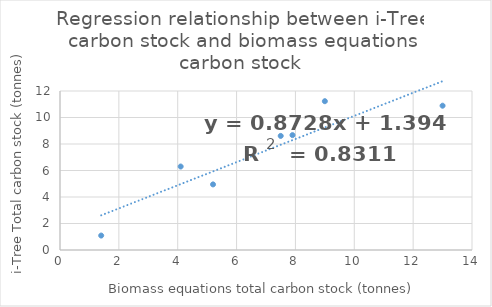
| Category | CPF-European Larch |
|---|---|
| 4.1 | 6.3 |
| 7.5 | 8.61 |
| 9.0 | 11.23 |
| 5.2 | 4.95 |
| 1.4 | 1.09 |
| 7.9 | 8.67 |
| 13.0 | 10.89 |